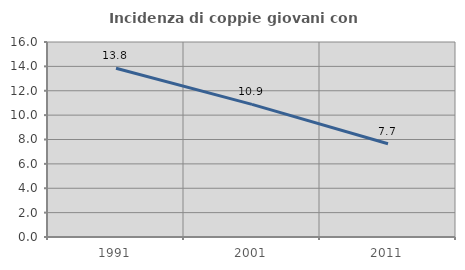
| Category | Incidenza di coppie giovani con figli |
|---|---|
| 1991.0 | 13.843 |
| 2001.0 | 10.884 |
| 2011.0 | 7.657 |